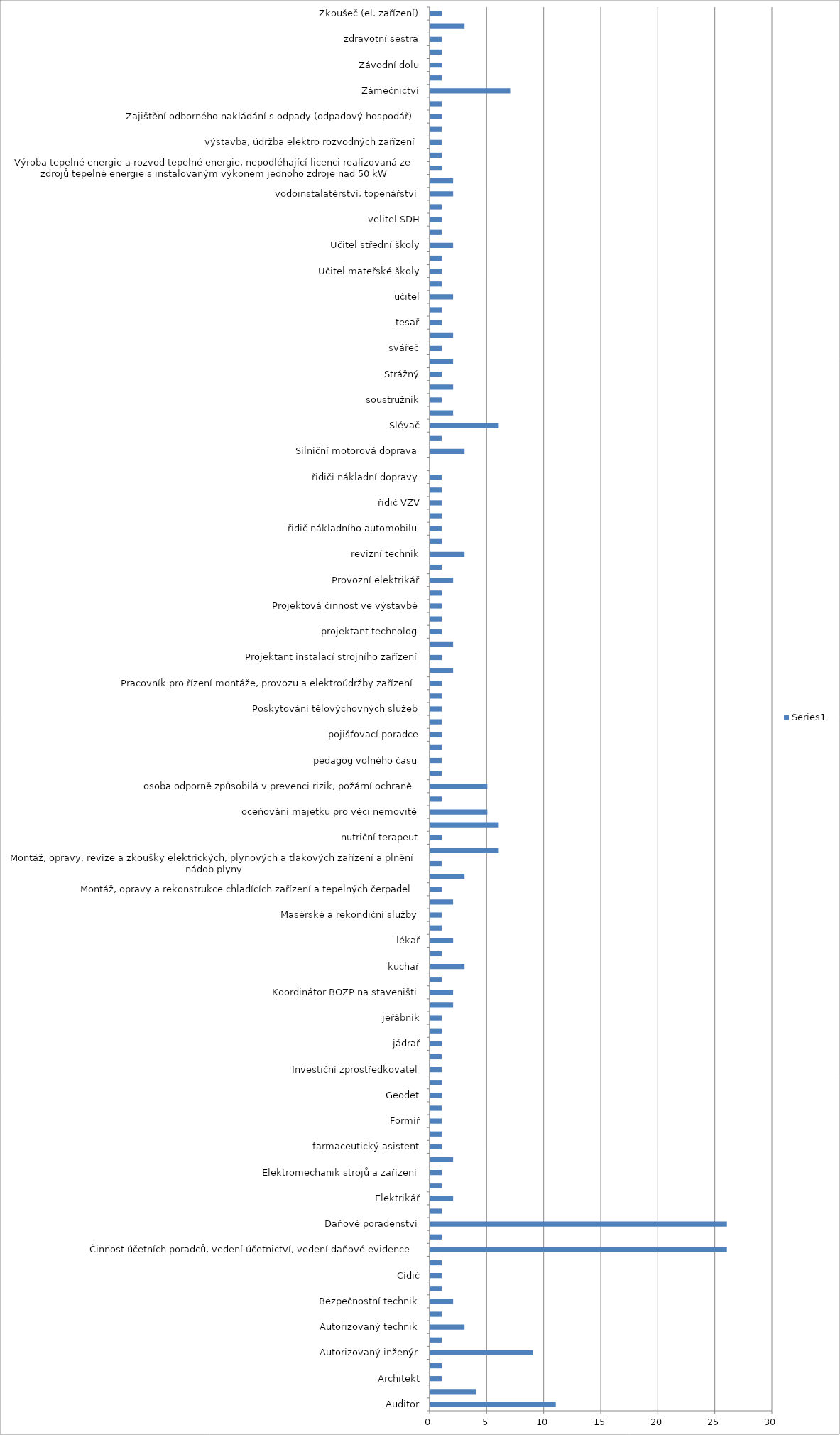
| Category | Series 0 |
|---|---|
| Auditor | 11 |
| Advokát | 4 |
| Architekt | 1 |
| Asistent zubního technika | 1 |
| Autorizovaný inženýr | 9 |
| Autorizovaný projektant | 1 |
| Autorizovaný technik | 3 |
| Báňský projektant | 1 |
| Bezpečnostní technik | 2 |
| Brusič | 1 |
| Cídič | 1 |
| Cvičitel fitness | 1 |
| Činnost účetních poradců, vedení účetnictví, vedení daňové evidence | 26 |
| Číšník/servírka | 1 |
| Daňové poradenství | 26 |
| Ekonom | 1 |
| Elektrikář | 2 |
| Elektromechanik | 1 |
| Elektromechanik strojů a zařízení | 1 |
| Energetický specialista | 2 |
| farmaceutický asistent | 1 |
| Finanční poradenství | 1 |
| Formíř | 1 |
| Fyzioterapeut | 1 |
| Geodet | 1 |
| Geologické práce | 1 |
| Investiční zprostředkovatel | 1 |
| Izolatérství | 1 |
| jádrař | 1 |
| jednorázové měření emisí | 1 |
| jeřábník | 1 |
| Kontrola těsnosti chladicích a klimatizačních zařízení obsahujících regulované látky nebo fluorované skleníkové plyny | 2 |
| Koordinátor BOZP na staveništi | 2 |
| kovomodelář | 1 |
| kuchař | 3 |
| laboratorní asistent | 1 |
| lékař | 2 |
| malířství | 1 |
| Masérské a rekondiční služby | 1 |
| modelářství | 2 |
| Montáž, opravy a rekonstrukce chladících zařízení a tepelných čerpadel | 1 |
| Montáž, opravy, revize a zkoušky elektrických zařízení | 3 |
| Montáž, opravy, revize a zkoušky elektrických, plynových a tlakových zařízení a plnění nádob plyny  | 1 |
| nástrojářství | 6 |
| nutriční terapeut | 1 |
| Obráběčství | 6 |
| oceňování majetku pro věci nemovité | 5 |
| odlévač | 1 |
| osoba odporně způsobilá v prevenci rizik, požární ochraně | 5 |
| ostraha osob | 1 |
| pedagog volného času | 1 |
| personalisté | 1 |
| pojišťovací poradce | 1 |
| Poskytování nebo zprostředkování spotřebitelského úvěru
pojištění | 1 |
| Poskytování tělovýchovných služeb | 1 |
| posuzování vlivů na životní prostředí (Ministerstvo životního prostředí) | 1 |
| Pracovník pro řízení montáže, provozu a elektroúdržby zařízení | 1 |
| Projektant instalace elektrických zařízení | 2 |
| Projektant instalací strojního zařízení | 1 |
| projektant stavebních konstrukcí | 2 |
| projektant technolog | 1 |
| projektant tlakových částí | 1 |
| Projektová činnost ve výstavbě | 1 |
| Provádění staveb, jejich změn a odstraňování | 1 |
| Provozní elektrikář | 2 |
| Provozování solárií | 1 |
| revizní technik | 3 |
| řidič | 1 |
| řidič nákladního automobilu | 1 |
| řidič tahače | 1 |
| řidič VZV | 1 |
| řidiči autobusu | 1 |
| řidiči nákladní dopravy | 1 |
|  | 0 |
| Silniční motorová doprava | 3 |
| sládek | 1 |
| Slévač | 6 |
| Sociální pracovník | 2 |
| soustružník | 1 |
| statik stavebních konstrukcí | 2 |
| Strážný | 1 |
| strojník | 2 |
| svářeč | 1 |
| tavič | 2 |
| tesař | 1 |
| Truhlářství | 1 |
| učitel | 2 |
| učitel druhého stupně základní školy | 1 |
| Učitel mateřské školy | 1 |
| učitel prvního stupně základní školy | 1 |
| Učitel střední školy | 2 |
| Údržba nebo servis zařízení obsahujícího regulované látky nebo flourované skleníkové plyny | 1 |
| velitel SDH | 1 |
| veškeré profese spojené s provozováním jaderného zařízení | 1 |
| vodoinstalatérství, topenářství | 2 |
| vychovatel | 2 |
| Výroba tepelné energie a rozvod tepelné energie, nepodléhající licenci realizovaná ze zdrojů tepelné energie s instalovaným výkonem jednoho zdroje nad 50 kW | 1 |
| Výroba, instalace, opravy elektrických strojů a přístrojů, elektronických a telekomunikačních zařízení | 1 |
| výstavba, údržba elektro rozvodných zařízení | 1 |
| vzdělání a praxi | 1 |
| Zajištění odborného nakládání s odpady (odpadový hospodář) | 1 |
| Zajišťování úkolů v prevenci rizik v oblasti BOZP | 1 |
| Zámečnictví | 7 |
| závodní autorizovaný inženýr | 1 |
| Závodní dolu | 1 |
| Závodní lomu | 1 |
| zdravotní sestra | 1 |
| Zednictví | 3 |
| Zkoušeč (el. zařízení) | 1 |